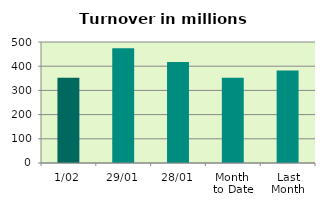
| Category | Series 0 |
|---|---|
| 1/02 | 351.999 |
| 29/01 | 474.02 |
| 28/01 | 417.678 |
| Month 
to Date | 351.999 |
| Last
Month | 381.872 |